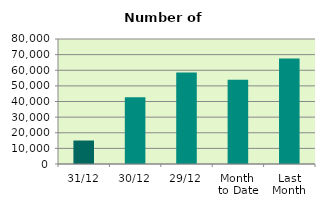
| Category | Series 0 |
|---|---|
| 31/12 | 15028 |
| 30/12 | 42728 |
| 29/12 | 58488 |
| Month 
to Date | 53997.143 |
| Last
Month | 67470.455 |